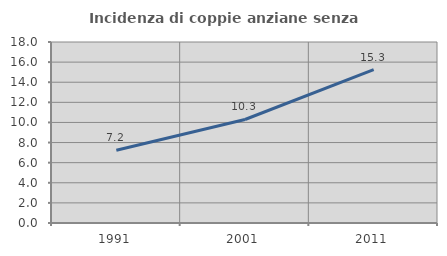
| Category | Incidenza di coppie anziane senza figli  |
|---|---|
| 1991.0 | 7.239 |
| 2001.0 | 10.294 |
| 2011.0 | 15.261 |